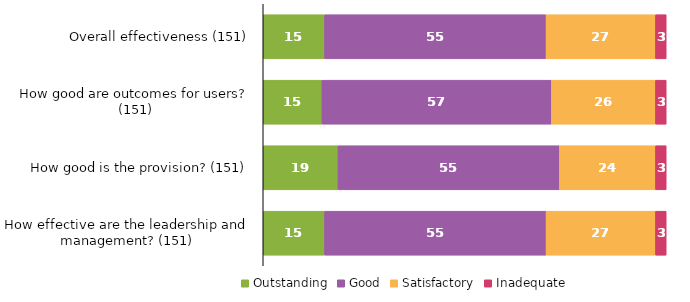
| Category | Outstanding | Good | Satisfactory | Inadequate |
|---|---|---|---|---|
| Overall effectiveness (151) | 15.232 | 54.967 | 27.152 | 2.649 |
| How good are outcomes for users? (151) | 14.57 | 56.954 | 25.828 | 2.649 |
| How good is the provision? (151) | 18.543 | 54.967 | 23.841 | 2.649 |
| How effective are the leadership and management? (151) | 15.232 | 54.967 | 27.152 | 2.649 |